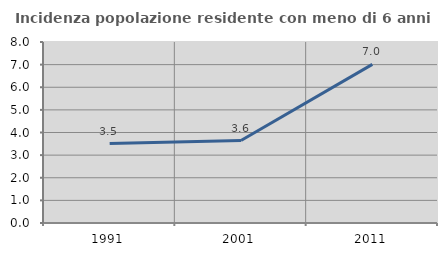
| Category | Incidenza popolazione residente con meno di 6 anni |
|---|---|
| 1991.0 | 3.513 |
| 2001.0 | 3.644 |
| 2011.0 | 7.011 |